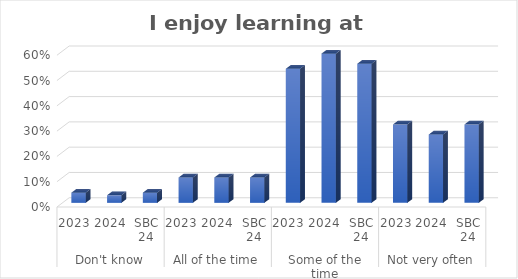
| Category | I enjoy learning at school. |
|---|---|
| 0 | 0.04 |
| 1 | 0.03 |
| 2 | 0.04 |
| 3 | 0.1 |
| 4 | 0.1 |
| 5 | 0.1 |
| 6 | 0.53 |
| 7 | 0.59 |
| 8 | 0.55 |
| 9 | 0.31 |
| 10 | 0.27 |
| 11 | 0.31 |